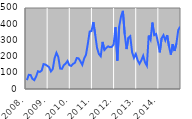
| Category | Series 0 |
|---|---|
| 2008. | 54.994 |
| 2  | 87.474 |
| 3  | 86.135 |
| 4  | 62.645 |
| 5  | 54.704 |
| 6  | 77.27 |
| 7  | 109.748 |
| 8  | 105.165 |
| 9  | 113.684 |
| 10  | 153.785 |
| 11  | 150.899 |
| 12  | 143.498 |
| 2009. | 134.647 |
| 2  | 108.545 |
| 3  | 123.293 |
| 4  | 190.728 |
| 5  | 223.339 |
| 6  | 197.686 |
| 7  | 126.216 |
| 8  | 124.556 |
| 9  | 147.014 |
| 10  | 157.018 |
| 11  | 172.969 |
| 12  | 146.812 |
| 2010. | 142.524 |
| 2  | 155.201 |
| 3  | 161.552 |
| 4  | 191.215 |
| 5  | 189.006 |
| 6  | 170.361 |
| 7  | 149.043 |
| 8  | 187.575 |
| 9  | 211.446 |
| 10  | 279.016 |
| 11  | 354.827 |
| 12  | 357.983 |
| 2011. | 413.285 |
| 2  | 336.333 |
| 3  | 253.611 |
| 4  | 216.077 |
| 5  | 202.149 |
| 6  | 290.811 |
| 7  | 240.867 |
| 8  | 253.335 |
| 9  | 263.473 |
| 10  | 258.282 |
| 11  | 259.981 |
| 12  | 275.644 |
| 2012. | 381.511 |
| 2  | 175.241 |
| 3  | 385.481 |
| 4  | 447.996 |
| 5  | 482.146 |
| 6  | 336.825 |
| 7  | 246.447 |
| 8  | 316.331 |
| 9  | 326.315 |
| 10  | 226.146 |
| 11  | 192.014 |
| 12  | 216.272 |
| 2013. | 177.478 |
| 2  | 155.586 |
| 3  | 176.504 |
| 4  | 205.318 |
| 5  | 164.253 |
| 6  | 143.867 |
| 7  | 329.606 |
| 8  | 304.567 |
| 9  | 410.034 |
| 10  | 332.622 |
| 11  | 339.949 |
| 12  | 288.901 |
| 2014. | 226.303 |
| 2  | 313.438 |
| 3  | 332.37 |
| 4  | 300.388 |
| 5  | 332.83 |
| 6  | 261.766 |
| 7  | 212.442 |
| 8  | 276.981 |
| 9  | 234.86 |
| 10  | 280.466 |
| 11  | 363.546 |
| 12  | 385.046 |